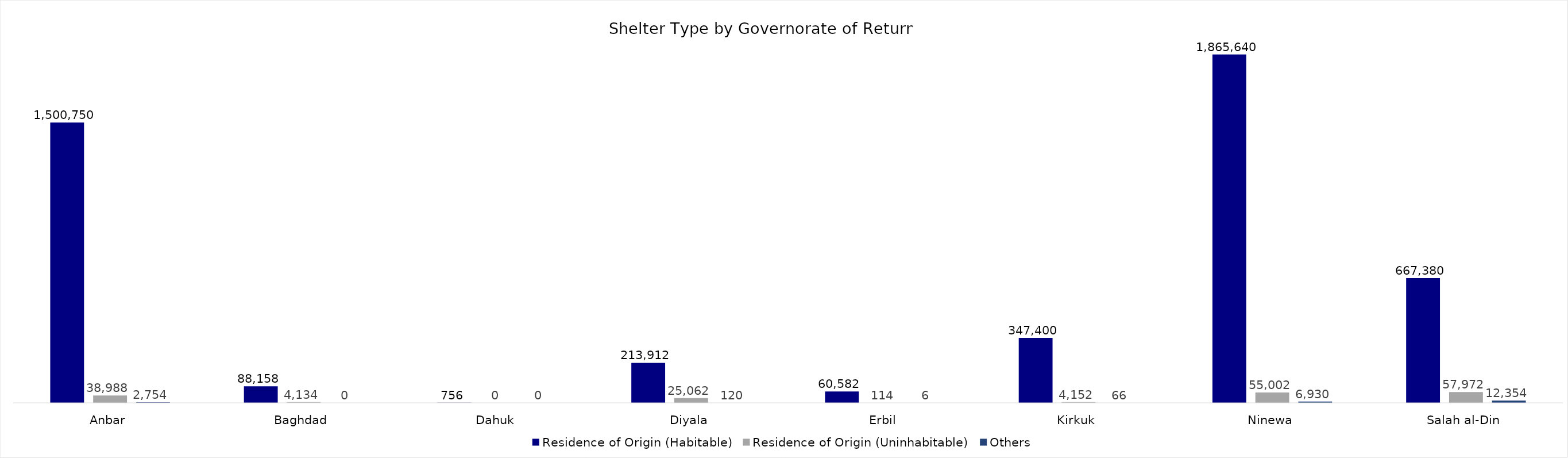
| Category | Residence of Origin (Habitable) | Residence of Origin (Uninhabitable) | Others |
|---|---|---|---|
| Anbar | 1500750 | 38988 | 2754 |
| Baghdad | 88158 | 4134 | 0 |
| Dahuk | 756 | 0 | 0 |
| Diyala | 213912 | 25062 | 120 |
| Erbil | 60582 | 114 | 6 |
| Kirkuk | 347400 | 4152 | 66 |
| Ninewa | 1865640 | 55002 | 6930 |
| Salah al-Din | 667380 | 57972 | 12354 |